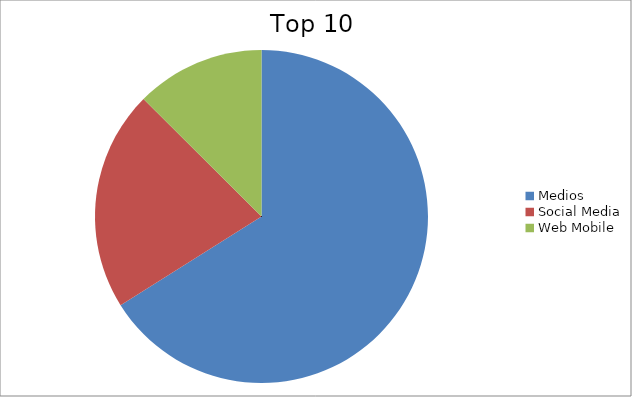
| Category | Series 0 |
|---|---|
| Medios | 66.07 |
| Social Media | 21.4 |
| Web Mobile | 12.54 |